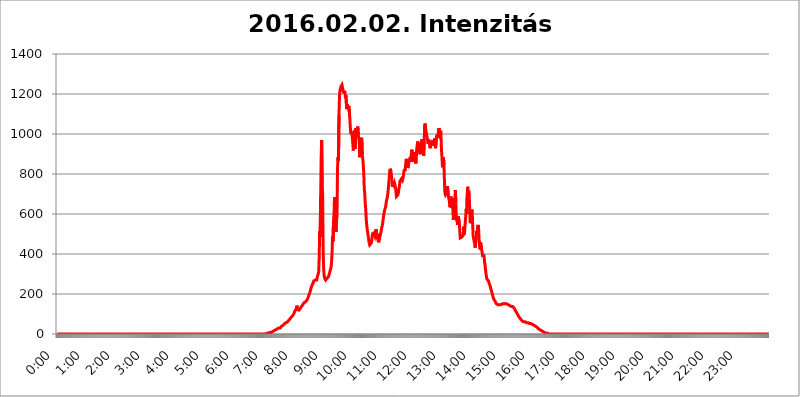
| Category | 2016.02.02. Intenzitás [W/m^2] |
|---|---|
| 0.0 | 0 |
| 0.0006944444444444445 | 0 |
| 0.001388888888888889 | 0 |
| 0.0020833333333333333 | 0 |
| 0.002777777777777778 | 0 |
| 0.003472222222222222 | 0 |
| 0.004166666666666667 | 0 |
| 0.004861111111111111 | 0 |
| 0.005555555555555556 | 0 |
| 0.0062499999999999995 | 0 |
| 0.006944444444444444 | 0 |
| 0.007638888888888889 | 0 |
| 0.008333333333333333 | 0 |
| 0.009027777777777779 | 0 |
| 0.009722222222222222 | 0 |
| 0.010416666666666666 | 0 |
| 0.011111111111111112 | 0 |
| 0.011805555555555555 | 0 |
| 0.012499999999999999 | 0 |
| 0.013194444444444444 | 0 |
| 0.013888888888888888 | 0 |
| 0.014583333333333332 | 0 |
| 0.015277777777777777 | 0 |
| 0.015972222222222224 | 0 |
| 0.016666666666666666 | 0 |
| 0.017361111111111112 | 0 |
| 0.018055555555555557 | 0 |
| 0.01875 | 0 |
| 0.019444444444444445 | 0 |
| 0.02013888888888889 | 0 |
| 0.020833333333333332 | 0 |
| 0.02152777777777778 | 0 |
| 0.022222222222222223 | 0 |
| 0.02291666666666667 | 0 |
| 0.02361111111111111 | 0 |
| 0.024305555555555556 | 0 |
| 0.024999999999999998 | 0 |
| 0.025694444444444447 | 0 |
| 0.02638888888888889 | 0 |
| 0.027083333333333334 | 0 |
| 0.027777777777777776 | 0 |
| 0.02847222222222222 | 0 |
| 0.029166666666666664 | 0 |
| 0.029861111111111113 | 0 |
| 0.030555555555555555 | 0 |
| 0.03125 | 0 |
| 0.03194444444444445 | 0 |
| 0.03263888888888889 | 0 |
| 0.03333333333333333 | 0 |
| 0.034027777777777775 | 0 |
| 0.034722222222222224 | 0 |
| 0.035416666666666666 | 0 |
| 0.036111111111111115 | 0 |
| 0.03680555555555556 | 0 |
| 0.0375 | 0 |
| 0.03819444444444444 | 0 |
| 0.03888888888888889 | 0 |
| 0.03958333333333333 | 0 |
| 0.04027777777777778 | 0 |
| 0.04097222222222222 | 0 |
| 0.041666666666666664 | 0 |
| 0.042361111111111106 | 0 |
| 0.04305555555555556 | 0 |
| 0.043750000000000004 | 0 |
| 0.044444444444444446 | 0 |
| 0.04513888888888889 | 0 |
| 0.04583333333333334 | 0 |
| 0.04652777777777778 | 0 |
| 0.04722222222222222 | 0 |
| 0.04791666666666666 | 0 |
| 0.04861111111111111 | 0 |
| 0.049305555555555554 | 0 |
| 0.049999999999999996 | 0 |
| 0.05069444444444445 | 0 |
| 0.051388888888888894 | 0 |
| 0.052083333333333336 | 0 |
| 0.05277777777777778 | 0 |
| 0.05347222222222222 | 0 |
| 0.05416666666666667 | 0 |
| 0.05486111111111111 | 0 |
| 0.05555555555555555 | 0 |
| 0.05625 | 0 |
| 0.05694444444444444 | 0 |
| 0.057638888888888885 | 0 |
| 0.05833333333333333 | 0 |
| 0.05902777777777778 | 0 |
| 0.059722222222222225 | 0 |
| 0.06041666666666667 | 0 |
| 0.061111111111111116 | 0 |
| 0.06180555555555556 | 0 |
| 0.0625 | 0 |
| 0.06319444444444444 | 0 |
| 0.06388888888888888 | 0 |
| 0.06458333333333334 | 0 |
| 0.06527777777777778 | 0 |
| 0.06597222222222222 | 0 |
| 0.06666666666666667 | 0 |
| 0.06736111111111111 | 0 |
| 0.06805555555555555 | 0 |
| 0.06874999999999999 | 0 |
| 0.06944444444444443 | 0 |
| 0.07013888888888889 | 0 |
| 0.07083333333333333 | 0 |
| 0.07152777777777779 | 0 |
| 0.07222222222222223 | 0 |
| 0.07291666666666667 | 0 |
| 0.07361111111111111 | 0 |
| 0.07430555555555556 | 0 |
| 0.075 | 0 |
| 0.07569444444444444 | 0 |
| 0.0763888888888889 | 0 |
| 0.07708333333333334 | 0 |
| 0.07777777777777778 | 0 |
| 0.07847222222222222 | 0 |
| 0.07916666666666666 | 0 |
| 0.0798611111111111 | 0 |
| 0.08055555555555556 | 0 |
| 0.08125 | 0 |
| 0.08194444444444444 | 0 |
| 0.08263888888888889 | 0 |
| 0.08333333333333333 | 0 |
| 0.08402777777777777 | 0 |
| 0.08472222222222221 | 0 |
| 0.08541666666666665 | 0 |
| 0.08611111111111112 | 0 |
| 0.08680555555555557 | 0 |
| 0.08750000000000001 | 0 |
| 0.08819444444444445 | 0 |
| 0.08888888888888889 | 0 |
| 0.08958333333333333 | 0 |
| 0.09027777777777778 | 0 |
| 0.09097222222222222 | 0 |
| 0.09166666666666667 | 0 |
| 0.09236111111111112 | 0 |
| 0.09305555555555556 | 0 |
| 0.09375 | 0 |
| 0.09444444444444444 | 0 |
| 0.09513888888888888 | 0 |
| 0.09583333333333333 | 0 |
| 0.09652777777777777 | 0 |
| 0.09722222222222222 | 0 |
| 0.09791666666666667 | 0 |
| 0.09861111111111111 | 0 |
| 0.09930555555555555 | 0 |
| 0.09999999999999999 | 0 |
| 0.10069444444444443 | 0 |
| 0.1013888888888889 | 0 |
| 0.10208333333333335 | 0 |
| 0.10277777777777779 | 0 |
| 0.10347222222222223 | 0 |
| 0.10416666666666667 | 0 |
| 0.10486111111111111 | 0 |
| 0.10555555555555556 | 0 |
| 0.10625 | 0 |
| 0.10694444444444444 | 0 |
| 0.1076388888888889 | 0 |
| 0.10833333333333334 | 0 |
| 0.10902777777777778 | 0 |
| 0.10972222222222222 | 0 |
| 0.1111111111111111 | 0 |
| 0.11180555555555556 | 0 |
| 0.11180555555555556 | 0 |
| 0.1125 | 0 |
| 0.11319444444444444 | 0 |
| 0.11388888888888889 | 0 |
| 0.11458333333333333 | 0 |
| 0.11527777777777777 | 0 |
| 0.11597222222222221 | 0 |
| 0.11666666666666665 | 0 |
| 0.1173611111111111 | 0 |
| 0.11805555555555557 | 0 |
| 0.11944444444444445 | 0 |
| 0.12013888888888889 | 0 |
| 0.12083333333333333 | 0 |
| 0.12152777777777778 | 0 |
| 0.12222222222222223 | 0 |
| 0.12291666666666667 | 0 |
| 0.12291666666666667 | 0 |
| 0.12361111111111112 | 0 |
| 0.12430555555555556 | 0 |
| 0.125 | 0 |
| 0.12569444444444444 | 0 |
| 0.12638888888888888 | 0 |
| 0.12708333333333333 | 0 |
| 0.16875 | 0 |
| 0.12847222222222224 | 0 |
| 0.12916666666666668 | 0 |
| 0.12986111111111112 | 0 |
| 0.13055555555555556 | 0 |
| 0.13125 | 0 |
| 0.13194444444444445 | 0 |
| 0.1326388888888889 | 0 |
| 0.13333333333333333 | 0 |
| 0.13402777777777777 | 0 |
| 0.13402777777777777 | 0 |
| 0.13472222222222222 | 0 |
| 0.13541666666666666 | 0 |
| 0.1361111111111111 | 0 |
| 0.13749999999999998 | 0 |
| 0.13819444444444443 | 0 |
| 0.1388888888888889 | 0 |
| 0.13958333333333334 | 0 |
| 0.14027777777777778 | 0 |
| 0.14097222222222222 | 0 |
| 0.14166666666666666 | 0 |
| 0.1423611111111111 | 0 |
| 0.14305555555555557 | 0 |
| 0.14375000000000002 | 0 |
| 0.14444444444444446 | 0 |
| 0.1451388888888889 | 0 |
| 0.1451388888888889 | 0 |
| 0.14652777777777778 | 0 |
| 0.14722222222222223 | 0 |
| 0.14791666666666667 | 0 |
| 0.1486111111111111 | 0 |
| 0.14930555555555555 | 0 |
| 0.15 | 0 |
| 0.15069444444444444 | 0 |
| 0.15138888888888888 | 0 |
| 0.15208333333333332 | 0 |
| 0.15277777777777776 | 0 |
| 0.15347222222222223 | 0 |
| 0.15416666666666667 | 0 |
| 0.15486111111111112 | 0 |
| 0.15555555555555556 | 0 |
| 0.15625 | 0 |
| 0.15694444444444444 | 0 |
| 0.15763888888888888 | 0 |
| 0.15833333333333333 | 0 |
| 0.15902777777777777 | 0 |
| 0.15972222222222224 | 0 |
| 0.16041666666666668 | 0 |
| 0.16111111111111112 | 0 |
| 0.16180555555555556 | 0 |
| 0.1625 | 0 |
| 0.16319444444444445 | 0 |
| 0.1638888888888889 | 0 |
| 0.16458333333333333 | 0 |
| 0.16527777777777777 | 0 |
| 0.16597222222222222 | 0 |
| 0.16666666666666666 | 0 |
| 0.1673611111111111 | 0 |
| 0.16805555555555554 | 0 |
| 0.16874999999999998 | 0 |
| 0.16944444444444443 | 0 |
| 0.17013888888888887 | 0 |
| 0.1708333333333333 | 0 |
| 0.17152777777777775 | 0 |
| 0.17222222222222225 | 0 |
| 0.1729166666666667 | 0 |
| 0.17361111111111113 | 0 |
| 0.17430555555555557 | 0 |
| 0.17500000000000002 | 0 |
| 0.17569444444444446 | 0 |
| 0.1763888888888889 | 0 |
| 0.17708333333333334 | 0 |
| 0.17777777777777778 | 0 |
| 0.17847222222222223 | 0 |
| 0.17916666666666667 | 0 |
| 0.1798611111111111 | 0 |
| 0.18055555555555555 | 0 |
| 0.18125 | 0 |
| 0.18194444444444444 | 0 |
| 0.1826388888888889 | 0 |
| 0.18333333333333335 | 0 |
| 0.1840277777777778 | 0 |
| 0.18472222222222223 | 0 |
| 0.18541666666666667 | 0 |
| 0.18611111111111112 | 0 |
| 0.18680555555555556 | 0 |
| 0.1875 | 0 |
| 0.18819444444444444 | 0 |
| 0.18888888888888888 | 0 |
| 0.18958333333333333 | 0 |
| 0.19027777777777777 | 0 |
| 0.1909722222222222 | 0 |
| 0.19166666666666665 | 0 |
| 0.19236111111111112 | 0 |
| 0.19305555555555554 | 0 |
| 0.19375 | 0 |
| 0.19444444444444445 | 0 |
| 0.1951388888888889 | 0 |
| 0.19583333333333333 | 0 |
| 0.19652777777777777 | 0 |
| 0.19722222222222222 | 0 |
| 0.19791666666666666 | 0 |
| 0.1986111111111111 | 0 |
| 0.19930555555555554 | 0 |
| 0.19999999999999998 | 0 |
| 0.20069444444444443 | 0 |
| 0.20138888888888887 | 0 |
| 0.2020833333333333 | 0 |
| 0.2027777777777778 | 0 |
| 0.2034722222222222 | 0 |
| 0.2041666666666667 | 0 |
| 0.20486111111111113 | 0 |
| 0.20555555555555557 | 0 |
| 0.20625000000000002 | 0 |
| 0.20694444444444446 | 0 |
| 0.2076388888888889 | 0 |
| 0.20833333333333334 | 0 |
| 0.20902777777777778 | 0 |
| 0.20972222222222223 | 0 |
| 0.21041666666666667 | 0 |
| 0.2111111111111111 | 0 |
| 0.21180555555555555 | 0 |
| 0.2125 | 0 |
| 0.21319444444444444 | 0 |
| 0.2138888888888889 | 0 |
| 0.21458333333333335 | 0 |
| 0.2152777777777778 | 0 |
| 0.21597222222222223 | 0 |
| 0.21666666666666667 | 0 |
| 0.21736111111111112 | 0 |
| 0.21805555555555556 | 0 |
| 0.21875 | 0 |
| 0.21944444444444444 | 0 |
| 0.22013888888888888 | 0 |
| 0.22083333333333333 | 0 |
| 0.22152777777777777 | 0 |
| 0.2222222222222222 | 0 |
| 0.22291666666666665 | 0 |
| 0.2236111111111111 | 0 |
| 0.22430555555555556 | 0 |
| 0.225 | 0 |
| 0.22569444444444445 | 0 |
| 0.2263888888888889 | 0 |
| 0.22708333333333333 | 0 |
| 0.22777777777777777 | 0 |
| 0.22847222222222222 | 0 |
| 0.22916666666666666 | 0 |
| 0.2298611111111111 | 0 |
| 0.23055555555555554 | 0 |
| 0.23124999999999998 | 0 |
| 0.23194444444444443 | 0 |
| 0.23263888888888887 | 0 |
| 0.2333333333333333 | 0 |
| 0.2340277777777778 | 0 |
| 0.2347222222222222 | 0 |
| 0.2354166666666667 | 0 |
| 0.23611111111111113 | 0 |
| 0.23680555555555557 | 0 |
| 0.23750000000000002 | 0 |
| 0.23819444444444446 | 0 |
| 0.2388888888888889 | 0 |
| 0.23958333333333334 | 0 |
| 0.24027777777777778 | 0 |
| 0.24097222222222223 | 0 |
| 0.24166666666666667 | 0 |
| 0.2423611111111111 | 0 |
| 0.24305555555555555 | 0 |
| 0.24375 | 0 |
| 0.24444444444444446 | 0 |
| 0.24513888888888888 | 0 |
| 0.24583333333333335 | 0 |
| 0.2465277777777778 | 0 |
| 0.24722222222222223 | 0 |
| 0.24791666666666667 | 0 |
| 0.24861111111111112 | 0 |
| 0.24930555555555556 | 0 |
| 0.25 | 0 |
| 0.25069444444444444 | 0 |
| 0.2513888888888889 | 0 |
| 0.2520833333333333 | 0 |
| 0.25277777777777777 | 0 |
| 0.2534722222222222 | 0 |
| 0.25416666666666665 | 0 |
| 0.2548611111111111 | 0 |
| 0.2555555555555556 | 0 |
| 0.25625000000000003 | 0 |
| 0.2569444444444445 | 0 |
| 0.2576388888888889 | 0 |
| 0.25833333333333336 | 0 |
| 0.2590277777777778 | 0 |
| 0.25972222222222224 | 0 |
| 0.2604166666666667 | 0 |
| 0.2611111111111111 | 0 |
| 0.26180555555555557 | 0 |
| 0.2625 | 0 |
| 0.26319444444444445 | 0 |
| 0.2638888888888889 | 0 |
| 0.26458333333333334 | 0 |
| 0.2652777777777778 | 0 |
| 0.2659722222222222 | 0 |
| 0.26666666666666666 | 0 |
| 0.2673611111111111 | 0 |
| 0.26805555555555555 | 0 |
| 0.26875 | 0 |
| 0.26944444444444443 | 0 |
| 0.2701388888888889 | 0 |
| 0.2708333333333333 | 0 |
| 0.27152777777777776 | 0 |
| 0.2722222222222222 | 0 |
| 0.27291666666666664 | 0 |
| 0.2736111111111111 | 0 |
| 0.2743055555555555 | 0 |
| 0.27499999999999997 | 0 |
| 0.27569444444444446 | 0 |
| 0.27638888888888885 | 0 |
| 0.27708333333333335 | 0 |
| 0.2777777777777778 | 0 |
| 0.27847222222222223 | 0 |
| 0.2791666666666667 | 0 |
| 0.2798611111111111 | 0 |
| 0.28055555555555556 | 0 |
| 0.28125 | 0 |
| 0.28194444444444444 | 0 |
| 0.2826388888888889 | 0 |
| 0.2833333333333333 | 0 |
| 0.28402777777777777 | 0 |
| 0.2847222222222222 | 0 |
| 0.28541666666666665 | 0 |
| 0.28611111111111115 | 0 |
| 0.28680555555555554 | 0 |
| 0.28750000000000003 | 0 |
| 0.2881944444444445 | 0 |
| 0.2888888888888889 | 0 |
| 0.28958333333333336 | 0 |
| 0.2902777777777778 | 0 |
| 0.29097222222222224 | 0 |
| 0.2916666666666667 | 0 |
| 0.2923611111111111 | 0 |
| 0.29305555555555557 | 3.525 |
| 0.29375 | 3.525 |
| 0.29444444444444445 | 3.525 |
| 0.2951388888888889 | 3.525 |
| 0.29583333333333334 | 3.525 |
| 0.2965277777777778 | 3.525 |
| 0.2972222222222222 | 3.525 |
| 0.29791666666666666 | 7.887 |
| 0.2986111111111111 | 7.887 |
| 0.29930555555555555 | 7.887 |
| 0.3 | 7.887 |
| 0.30069444444444443 | 12.257 |
| 0.3013888888888889 | 12.257 |
| 0.3020833333333333 | 12.257 |
| 0.30277777777777776 | 12.257 |
| 0.3034722222222222 | 12.257 |
| 0.30416666666666664 | 16.636 |
| 0.3048611111111111 | 16.636 |
| 0.3055555555555555 | 16.636 |
| 0.30624999999999997 | 21.024 |
| 0.3069444444444444 | 21.024 |
| 0.3076388888888889 | 21.024 |
| 0.30833333333333335 | 25.419 |
| 0.3090277777777778 | 25.419 |
| 0.30972222222222223 | 25.419 |
| 0.3104166666666667 | 29.823 |
| 0.3111111111111111 | 29.823 |
| 0.31180555555555556 | 29.823 |
| 0.3125 | 29.823 |
| 0.31319444444444444 | 34.234 |
| 0.3138888888888889 | 34.234 |
| 0.3145833333333333 | 38.653 |
| 0.31527777777777777 | 38.653 |
| 0.3159722222222222 | 38.653 |
| 0.31666666666666665 | 43.079 |
| 0.31736111111111115 | 47.511 |
| 0.31805555555555554 | 47.511 |
| 0.31875000000000003 | 51.951 |
| 0.3194444444444445 | 51.951 |
| 0.3201388888888889 | 56.398 |
| 0.32083333333333336 | 56.398 |
| 0.3215277777777778 | 60.85 |
| 0.32222222222222224 | 60.85 |
| 0.3229166666666667 | 60.85 |
| 0.3236111111111111 | 65.31 |
| 0.32430555555555557 | 65.31 |
| 0.325 | 69.775 |
| 0.32569444444444445 | 74.246 |
| 0.3263888888888889 | 74.246 |
| 0.32708333333333334 | 78.722 |
| 0.3277777777777778 | 83.205 |
| 0.3284722222222222 | 83.205 |
| 0.32916666666666666 | 87.692 |
| 0.3298611111111111 | 87.692 |
| 0.33055555555555555 | 92.184 |
| 0.33125 | 96.682 |
| 0.33194444444444443 | 101.184 |
| 0.3326388888888889 | 110.201 |
| 0.3333333333333333 | 114.716 |
| 0.3340277777777778 | 119.235 |
| 0.3347222222222222 | 123.758 |
| 0.3354166666666667 | 128.284 |
| 0.3361111111111111 | 141.884 |
| 0.3368055555555556 | 123.758 |
| 0.33749999999999997 | 119.235 |
| 0.33819444444444446 | 119.235 |
| 0.33888888888888885 | 119.235 |
| 0.33958333333333335 | 123.758 |
| 0.34027777777777773 | 123.758 |
| 0.34097222222222223 | 128.284 |
| 0.3416666666666666 | 132.814 |
| 0.3423611111111111 | 137.347 |
| 0.3430555555555555 | 137.347 |
| 0.34375 | 141.884 |
| 0.3444444444444445 | 146.423 |
| 0.3451388888888889 | 150.964 |
| 0.3458333333333334 | 155.509 |
| 0.34652777777777777 | 155.509 |
| 0.34722222222222227 | 155.509 |
| 0.34791666666666665 | 160.056 |
| 0.34861111111111115 | 160.056 |
| 0.34930555555555554 | 164.605 |
| 0.35000000000000003 | 169.156 |
| 0.3506944444444444 | 173.709 |
| 0.3513888888888889 | 178.264 |
| 0.3520833333333333 | 182.82 |
| 0.3527777777777778 | 191.937 |
| 0.3534722222222222 | 196.497 |
| 0.3541666666666667 | 205.62 |
| 0.3548611111111111 | 214.746 |
| 0.35555555555555557 | 223.873 |
| 0.35625 | 233 |
| 0.35694444444444445 | 237.564 |
| 0.3576388888888889 | 246.689 |
| 0.35833333333333334 | 251.251 |
| 0.3590277777777778 | 255.813 |
| 0.3597222222222222 | 264.932 |
| 0.36041666666666666 | 264.932 |
| 0.3611111111111111 | 260.373 |
| 0.36180555555555555 | 269.49 |
| 0.3625 | 274.047 |
| 0.36319444444444443 | 274.047 |
| 0.3638888888888889 | 269.49 |
| 0.3645833333333333 | 283.156 |
| 0.3652777777777778 | 292.259 |
| 0.3659722222222222 | 296.808 |
| 0.3666666666666667 | 310.44 |
| 0.3673611111111111 | 378.224 |
| 0.3680555555555556 | 515.223 |
| 0.36874999999999997 | 484.735 |
| 0.36944444444444446 | 683.473 |
| 0.37013888888888885 | 879.719 |
| 0.37083333333333335 | 970.034 |
| 0.37152777777777773 | 747.834 |
| 0.37222222222222223 | 699.717 |
| 0.3729166666666666 | 418.492 |
| 0.3736111111111111 | 328.584 |
| 0.3743055555555555 | 292.259 |
| 0.375 | 278.603 |
| 0.3756944444444445 | 274.047 |
| 0.3763888888888889 | 269.49 |
| 0.3770833333333334 | 269.49 |
| 0.37777777777777777 | 274.047 |
| 0.37847222222222227 | 278.603 |
| 0.37916666666666665 | 278.603 |
| 0.37986111111111115 | 283.156 |
| 0.38055555555555554 | 287.709 |
| 0.38125000000000003 | 296.808 |
| 0.3819444444444444 | 305.898 |
| 0.3826388888888889 | 314.98 |
| 0.3833333333333333 | 324.052 |
| 0.3840277777777778 | 333.113 |
| 0.3847222222222222 | 360.221 |
| 0.3854166666666667 | 400.638 |
| 0.3861111111111111 | 489.108 |
| 0.38680555555555557 | 462.786 |
| 0.3875 | 566.793 |
| 0.38819444444444445 | 600.661 |
| 0.3888888888888889 | 683.473 |
| 0.38958333333333334 | 625.784 |
| 0.3902777777777778 | 562.53 |
| 0.3909722222222222 | 510.885 |
| 0.39166666666666666 | 575.299 |
| 0.3923611111111111 | 583.779 |
| 0.39305555555555555 | 822.26 |
| 0.39375 | 883.516 |
| 0.39444444444444443 | 864.493 |
| 0.3951388888888889 | 1093.653 |
| 0.3958333333333333 | 1186.03 |
| 0.3965277777777778 | 1217.812 |
| 0.3972222222222222 | 1225.859 |
| 0.3979166666666667 | 1238.014 |
| 0.3986111111111111 | 1233.951 |
| 0.3993055555555556 | 1246.176 |
| 0.39999999999999997 | 1233.951 |
| 0.40069444444444446 | 1238.014 |
| 0.40138888888888885 | 1209.807 |
| 0.40208333333333335 | 1209.807 |
| 0.40277777777777773 | 1213.804 |
| 0.40347222222222223 | 1209.807 |
| 0.4041666666666666 | 1182.099 |
| 0.4048611111111111 | 1193.918 |
| 0.4055555555555555 | 1150.946 |
| 0.40625 | 1124.056 |
| 0.4069444444444445 | 1147.086 |
| 0.4076388888888889 | 1139.384 |
| 0.4083333333333334 | 1131.708 |
| 0.40902777777777777 | 1139.384 |
| 0.40972222222222227 | 1108.816 |
| 0.41041666666666665 | 1074.789 |
| 0.41111111111111115 | 1029.798 |
| 0.41180555555555554 | 999.916 |
| 0.41250000000000003 | 1007.383 |
| 0.4131944444444444 | 999.916 |
| 0.4138888888888889 | 981.244 |
| 0.4145833333333333 | 951.327 |
| 0.4152777777777778 | 917.534 |
| 0.4159722222222222 | 970.034 |
| 0.4166666666666667 | 1007.383 |
| 0.4173611111111111 | 1018.587 |
| 0.41805555555555557 | 925.06 |
| 0.41875 | 1029.798 |
| 0.41944444444444445 | 1029.798 |
| 0.4201388888888889 | 999.916 |
| 0.42083333333333334 | 1026.06 |
| 0.4215277777777778 | 1037.277 |
| 0.4222222222222222 | 996.182 |
| 0.42291666666666666 | 999.916 |
| 0.4236111111111111 | 962.555 |
| 0.42430555555555555 | 883.516 |
| 0.425 | 932.576 |
| 0.42569444444444443 | 962.555 |
| 0.4263888888888889 | 973.772 |
| 0.4270833333333333 | 981.244 |
| 0.4277777777777778 | 894.885 |
| 0.4284722222222222 | 879.719 |
| 0.4291666666666667 | 849.199 |
| 0.4298611111111111 | 806.757 |
| 0.4305555555555556 | 727.896 |
| 0.43124999999999997 | 703.762 |
| 0.43194444444444446 | 654.791 |
| 0.43263888888888885 | 625.784 |
| 0.43333333333333335 | 575.299 |
| 0.43402777777777773 | 545.416 |
| 0.43472222222222223 | 523.88 |
| 0.4354166666666666 | 506.542 |
| 0.4361111111111111 | 506.542 |
| 0.4368055555555555 | 471.582 |
| 0.4375 | 453.968 |
| 0.4381944444444445 | 445.129 |
| 0.4388888888888889 | 440.702 |
| 0.4395833333333334 | 440.702 |
| 0.44027777777777777 | 453.968 |
| 0.44097222222222227 | 462.786 |
| 0.44166666666666665 | 489.108 |
| 0.44236111111111115 | 502.192 |
| 0.44305555555555554 | 502.192 |
| 0.44375000000000003 | 497.836 |
| 0.4444444444444444 | 506.542 |
| 0.4451388888888889 | 506.542 |
| 0.4458333333333333 | 489.108 |
| 0.4465277777777778 | 497.836 |
| 0.4472222222222222 | 523.88 |
| 0.4479166666666667 | 489.108 |
| 0.4486111111111111 | 502.192 |
| 0.44930555555555557 | 475.972 |
| 0.45 | 471.582 |
| 0.45069444444444445 | 458.38 |
| 0.4513888888888889 | 462.786 |
| 0.45208333333333334 | 480.356 |
| 0.4527777777777778 | 489.108 |
| 0.4534722222222222 | 502.192 |
| 0.45416666666666666 | 510.885 |
| 0.4548611111111111 | 528.2 |
| 0.45555555555555555 | 536.82 |
| 0.45625 | 549.704 |
| 0.45694444444444443 | 571.049 |
| 0.4576388888888889 | 588.009 |
| 0.4583333333333333 | 604.864 |
| 0.4590277777777778 | 617.436 |
| 0.4597222222222222 | 617.436 |
| 0.4604166666666667 | 634.105 |
| 0.4611111111111111 | 650.667 |
| 0.4618055555555556 | 667.123 |
| 0.46249999999999997 | 671.22 |
| 0.46319444444444446 | 687.544 |
| 0.46388888888888885 | 711.832 |
| 0.46458333333333335 | 735.89 |
| 0.46527777777777773 | 767.62 |
| 0.46597222222222223 | 798.974 |
| 0.4666666666666666 | 826.123 |
| 0.4673611111111111 | 826.123 |
| 0.4680555555555555 | 814.519 |
| 0.46875 | 810.641 |
| 0.4694444444444445 | 810.641 |
| 0.4701388888888889 | 735.89 |
| 0.4708333333333334 | 763.674 |
| 0.47152777777777777 | 759.723 |
| 0.47222222222222227 | 747.834 |
| 0.47291666666666665 | 755.766 |
| 0.47361111111111115 | 759.723 |
| 0.47430555555555554 | 735.89 |
| 0.47500000000000003 | 711.832 |
| 0.4756944444444444 | 687.544 |
| 0.4763888888888889 | 683.473 |
| 0.4770833333333333 | 691.608 |
| 0.4777777777777778 | 695.666 |
| 0.4784722222222222 | 707.8 |
| 0.4791666666666667 | 727.896 |
| 0.4798611111111111 | 735.89 |
| 0.48055555555555557 | 763.674 |
| 0.48125 | 759.723 |
| 0.48194444444444445 | 759.723 |
| 0.4826388888888889 | 775.492 |
| 0.48333333333333334 | 771.559 |
| 0.4840277777777778 | 767.62 |
| 0.4847222222222222 | 767.62 |
| 0.48541666666666666 | 787.258 |
| 0.4861111111111111 | 810.641 |
| 0.48680555555555555 | 822.26 |
| 0.4875 | 814.519 |
| 0.48819444444444443 | 829.981 |
| 0.4888888888888889 | 856.855 |
| 0.4895833333333333 | 875.918 |
| 0.4902777777777778 | 849.199 |
| 0.4909722222222222 | 841.526 |
| 0.4916666666666667 | 829.981 |
| 0.4923611111111111 | 837.682 |
| 0.4930555555555556 | 856.855 |
| 0.49374999999999997 | 868.305 |
| 0.49444444444444446 | 864.493 |
| 0.49513888888888885 | 883.516 |
| 0.49583333333333335 | 860.676 |
| 0.49652777777777773 | 856.855 |
| 0.49722222222222223 | 921.298 |
| 0.4979166666666666 | 902.447 |
| 0.4986111111111111 | 868.305 |
| 0.4993055555555555 | 860.676 |
| 0.5 | 894.885 |
| 0.5006944444444444 | 909.996 |
| 0.5013888888888889 | 864.493 |
| 0.5020833333333333 | 898.668 |
| 0.5027777777777778 | 853.029 |
| 0.5034722222222222 | 879.719 |
| 0.5041666666666667 | 925.06 |
| 0.5048611111111111 | 928.819 |
| 0.5055555555555555 | 962.555 |
| 0.50625 | 936.33 |
| 0.5069444444444444 | 955.071 |
| 0.5076388888888889 | 925.06 |
| 0.5083333333333333 | 909.996 |
| 0.5090277777777777 | 898.668 |
| 0.5097222222222222 | 940.082 |
| 0.5104166666666666 | 958.814 |
| 0.5111111111111112 | 951.327 |
| 0.5118055555555555 | 973.772 |
| 0.5125000000000001 | 936.33 |
| 0.5131944444444444 | 936.33 |
| 0.513888888888889 | 891.099 |
| 0.5145833333333333 | 951.327 |
| 0.5152777777777778 | 1041.019 |
| 0.5159722222222222 | 1052.255 |
| 0.5166666666666667 | 1026.06 |
| 0.517361111111111 | 1022.323 |
| 0.5180555555555556 | 996.182 |
| 0.5187499999999999 | 999.916 |
| 0.5194444444444445 | 970.034 |
| 0.5201388888888888 | 951.327 |
| 0.5208333333333334 | 973.772 |
| 0.5215277777777778 | 962.555 |
| 0.5222222222222223 | 947.58 |
| 0.5229166666666667 | 928.819 |
| 0.5236111111111111 | 928.819 |
| 0.5243055555555556 | 962.555 |
| 0.525 | 966.295 |
| 0.5256944444444445 | 947.58 |
| 0.5263888888888889 | 970.034 |
| 0.5270833333333333 | 962.555 |
| 0.5277777777777778 | 962.555 |
| 0.5284722222222222 | 940.082 |
| 0.5291666666666667 | 977.508 |
| 0.5298611111111111 | 970.034 |
| 0.5305555555555556 | 928.819 |
| 0.53125 | 928.819 |
| 0.5319444444444444 | 984.98 |
| 0.5326388888888889 | 996.182 |
| 0.5333333333333333 | 981.244 |
| 0.5340277777777778 | 996.182 |
| 0.5347222222222222 | 1014.852 |
| 0.5354166666666667 | 1029.798 |
| 0.5361111111111111 | 1026.06 |
| 0.5368055555555555 | 992.448 |
| 0.5375 | 992.448 |
| 0.5381944444444444 | 999.916 |
| 0.5388888888888889 | 921.298 |
| 0.5395833333333333 | 883.516 |
| 0.5402777777777777 | 833.834 |
| 0.5409722222222222 | 872.114 |
| 0.5416666666666666 | 883.516 |
| 0.5423611111111112 | 849.199 |
| 0.5430555555555555 | 763.674 |
| 0.5437500000000001 | 703.762 |
| 0.5444444444444444 | 695.666 |
| 0.545138888888889 | 695.666 |
| 0.5458333333333333 | 703.762 |
| 0.5465277777777778 | 727.896 |
| 0.5472222222222222 | 739.877 |
| 0.5479166666666667 | 743.859 |
| 0.548611111111111 | 687.544 |
| 0.5493055555555556 | 675.311 |
| 0.5499999999999999 | 663.019 |
| 0.5506944444444445 | 634.105 |
| 0.5513888888888888 | 642.4 |
| 0.5520833333333334 | 687.544 |
| 0.5527777777777778 | 629.948 |
| 0.5534722222222223 | 650.667 |
| 0.5541666666666667 | 679.395 |
| 0.5548611111111111 | 625.784 |
| 0.5555555555555556 | 571.049 |
| 0.55625 | 596.45 |
| 0.5569444444444445 | 625.784 |
| 0.5576388888888889 | 663.019 |
| 0.5583333333333333 | 719.877 |
| 0.5590277777777778 | 654.791 |
| 0.5597222222222222 | 575.299 |
| 0.5604166666666667 | 579.542 |
| 0.5611111111111111 | 558.261 |
| 0.5618055555555556 | 545.416 |
| 0.5625 | 588.009 |
| 0.5631944444444444 | 592.233 |
| 0.5638888888888889 | 558.261 |
| 0.5645833333333333 | 515.223 |
| 0.5652777777777778 | 480.356 |
| 0.5659722222222222 | 480.356 |
| 0.5666666666666667 | 475.972 |
| 0.5673611111111111 | 484.735 |
| 0.5680555555555555 | 484.735 |
| 0.56875 | 480.356 |
| 0.5694444444444444 | 493.475 |
| 0.5701388888888889 | 536.82 |
| 0.5708333333333333 | 497.836 |
| 0.5715277777777777 | 519.555 |
| 0.5722222222222222 | 558.261 |
| 0.5729166666666666 | 588.009 |
| 0.5736111111111112 | 625.784 |
| 0.5743055555555555 | 600.661 |
| 0.5750000000000001 | 695.666 |
| 0.5756944444444444 | 735.89 |
| 0.576388888888889 | 687.544 |
| 0.5770833333333333 | 683.473 |
| 0.5777777777777778 | 695.666 |
| 0.5784722222222222 | 625.784 |
| 0.5791666666666667 | 553.986 |
| 0.579861111111111 | 549.704 |
| 0.5805555555555556 | 566.793 |
| 0.5812499999999999 | 621.613 |
| 0.5819444444444445 | 613.252 |
| 0.5826388888888888 | 549.704 |
| 0.5833333333333334 | 489.108 |
| 0.5840277777777778 | 489.108 |
| 0.5847222222222223 | 462.786 |
| 0.5854166666666667 | 453.968 |
| 0.5861111111111111 | 431.833 |
| 0.5868055555555556 | 453.968 |
| 0.5875 | 475.972 |
| 0.5881944444444445 | 515.223 |
| 0.5888888888888889 | 506.542 |
| 0.5895833333333333 | 502.192 |
| 0.5902777777777778 | 545.416 |
| 0.5909722222222222 | 523.88 |
| 0.5916666666666667 | 471.582 |
| 0.5923611111111111 | 440.702 |
| 0.5930555555555556 | 422.943 |
| 0.59375 | 458.38 |
| 0.5944444444444444 | 453.968 |
| 0.5951388888888889 | 422.943 |
| 0.5958333333333333 | 409.574 |
| 0.5965277777777778 | 391.685 |
| 0.5972222222222222 | 387.202 |
| 0.5979166666666667 | 387.202 |
| 0.5986111111111111 | 391.685 |
| 0.5993055555555555 | 360.221 |
| 0.6 | 346.682 |
| 0.6006944444444444 | 319.517 |
| 0.6013888888888889 | 301.354 |
| 0.6020833333333333 | 283.156 |
| 0.6027777777777777 | 274.047 |
| 0.6034722222222222 | 278.603 |
| 0.6041666666666666 | 269.49 |
| 0.6048611111111112 | 264.932 |
| 0.6055555555555555 | 255.813 |
| 0.6062500000000001 | 251.251 |
| 0.6069444444444444 | 242.127 |
| 0.607638888888889 | 233 |
| 0.6083333333333333 | 223.873 |
| 0.6090277777777778 | 214.746 |
| 0.6097222222222222 | 205.62 |
| 0.6104166666666667 | 196.497 |
| 0.611111111111111 | 187.378 |
| 0.6118055555555556 | 178.264 |
| 0.6124999999999999 | 173.709 |
| 0.6131944444444445 | 169.156 |
| 0.6138888888888888 | 164.605 |
| 0.6145833333333334 | 160.056 |
| 0.6152777777777778 | 155.509 |
| 0.6159722222222223 | 150.964 |
| 0.6166666666666667 | 150.964 |
| 0.6173611111111111 | 146.423 |
| 0.6180555555555556 | 146.423 |
| 0.61875 | 146.423 |
| 0.6194444444444445 | 146.423 |
| 0.6201388888888889 | 146.423 |
| 0.6208333333333333 | 146.423 |
| 0.6215277777777778 | 146.423 |
| 0.6222222222222222 | 146.423 |
| 0.6229166666666667 | 146.423 |
| 0.6236111111111111 | 146.423 |
| 0.6243055555555556 | 150.964 |
| 0.625 | 150.964 |
| 0.6256944444444444 | 150.964 |
| 0.6263888888888889 | 150.964 |
| 0.6270833333333333 | 150.964 |
| 0.6277777777777778 | 150.964 |
| 0.6284722222222222 | 150.964 |
| 0.6291666666666667 | 150.964 |
| 0.6298611111111111 | 150.964 |
| 0.6305555555555555 | 150.964 |
| 0.63125 | 146.423 |
| 0.6319444444444444 | 146.423 |
| 0.6326388888888889 | 146.423 |
| 0.6333333333333333 | 141.884 |
| 0.6340277777777777 | 141.884 |
| 0.6347222222222222 | 141.884 |
| 0.6354166666666666 | 137.347 |
| 0.6361111111111112 | 137.347 |
| 0.6368055555555555 | 137.347 |
| 0.6375000000000001 | 137.347 |
| 0.6381944444444444 | 137.347 |
| 0.638888888888889 | 137.347 |
| 0.6395833333333333 | 132.814 |
| 0.6402777777777778 | 132.814 |
| 0.6409722222222222 | 128.284 |
| 0.6416666666666667 | 123.758 |
| 0.642361111111111 | 119.235 |
| 0.6430555555555556 | 114.716 |
| 0.6437499999999999 | 110.201 |
| 0.6444444444444445 | 105.69 |
| 0.6451388888888888 | 101.184 |
| 0.6458333333333334 | 96.682 |
| 0.6465277777777778 | 92.184 |
| 0.6472222222222223 | 87.692 |
| 0.6479166666666667 | 83.205 |
| 0.6486111111111111 | 83.205 |
| 0.6493055555555556 | 78.722 |
| 0.65 | 74.246 |
| 0.6506944444444445 | 69.775 |
| 0.6513888888888889 | 69.775 |
| 0.6520833333333333 | 65.31 |
| 0.6527777777777778 | 65.31 |
| 0.6534722222222222 | 65.31 |
| 0.6541666666666667 | 60.85 |
| 0.6548611111111111 | 60.85 |
| 0.6555555555555556 | 60.85 |
| 0.65625 | 60.85 |
| 0.6569444444444444 | 60.85 |
| 0.6576388888888889 | 56.398 |
| 0.6583333333333333 | 56.398 |
| 0.6590277777777778 | 56.398 |
| 0.6597222222222222 | 56.398 |
| 0.6604166666666667 | 56.398 |
| 0.6611111111111111 | 56.398 |
| 0.6618055555555555 | 56.398 |
| 0.6625 | 51.951 |
| 0.6631944444444444 | 51.951 |
| 0.6638888888888889 | 51.951 |
| 0.6645833333333333 | 51.951 |
| 0.6652777777777777 | 47.511 |
| 0.6659722222222222 | 47.511 |
| 0.6666666666666666 | 47.511 |
| 0.6673611111111111 | 47.511 |
| 0.6680555555555556 | 43.079 |
| 0.6687500000000001 | 43.079 |
| 0.6694444444444444 | 43.079 |
| 0.6701388888888888 | 38.653 |
| 0.6708333333333334 | 38.653 |
| 0.6715277777777778 | 38.653 |
| 0.6722222222222222 | 34.234 |
| 0.6729166666666666 | 34.234 |
| 0.6736111111111112 | 29.823 |
| 0.6743055555555556 | 29.823 |
| 0.6749999999999999 | 25.419 |
| 0.6756944444444444 | 25.419 |
| 0.6763888888888889 | 21.024 |
| 0.6770833333333334 | 21.024 |
| 0.6777777777777777 | 21.024 |
| 0.6784722222222223 | 16.636 |
| 0.6791666666666667 | 16.636 |
| 0.6798611111111111 | 12.257 |
| 0.6805555555555555 | 12.257 |
| 0.68125 | 12.257 |
| 0.6819444444444445 | 7.887 |
| 0.6826388888888889 | 7.887 |
| 0.6833333333333332 | 7.887 |
| 0.6840277777777778 | 3.525 |
| 0.6847222222222222 | 3.525 |
| 0.6854166666666667 | 3.525 |
| 0.686111111111111 | 3.525 |
| 0.6868055555555556 | 3.525 |
| 0.6875 | 3.525 |
| 0.6881944444444444 | 0 |
| 0.688888888888889 | 0 |
| 0.6895833333333333 | 0 |
| 0.6902777777777778 | 0 |
| 0.6909722222222222 | 0 |
| 0.6916666666666668 | 0 |
| 0.6923611111111111 | 0 |
| 0.6930555555555555 | 0 |
| 0.69375 | 0 |
| 0.6944444444444445 | 0 |
| 0.6951388888888889 | 0 |
| 0.6958333333333333 | 0 |
| 0.6965277777777777 | 0 |
| 0.6972222222222223 | 0 |
| 0.6979166666666666 | 0 |
| 0.6986111111111111 | 0 |
| 0.6993055555555556 | 0 |
| 0.7000000000000001 | 0 |
| 0.7006944444444444 | 0 |
| 0.7013888888888888 | 0 |
| 0.7020833333333334 | 0 |
| 0.7027777777777778 | 0 |
| 0.7034722222222222 | 0 |
| 0.7041666666666666 | 0 |
| 0.7048611111111112 | 0 |
| 0.7055555555555556 | 0 |
| 0.7062499999999999 | 0 |
| 0.7069444444444444 | 0 |
| 0.7076388888888889 | 0 |
| 0.7083333333333334 | 0 |
| 0.7090277777777777 | 0 |
| 0.7097222222222223 | 0 |
| 0.7104166666666667 | 0 |
| 0.7111111111111111 | 0 |
| 0.7118055555555555 | 0 |
| 0.7125 | 0 |
| 0.7131944444444445 | 0 |
| 0.7138888888888889 | 0 |
| 0.7145833333333332 | 0 |
| 0.7152777777777778 | 0 |
| 0.7159722222222222 | 0 |
| 0.7166666666666667 | 0 |
| 0.717361111111111 | 0 |
| 0.7180555555555556 | 0 |
| 0.71875 | 0 |
| 0.7194444444444444 | 0 |
| 0.720138888888889 | 0 |
| 0.7208333333333333 | 0 |
| 0.7215277777777778 | 0 |
| 0.7222222222222222 | 0 |
| 0.7229166666666668 | 0 |
| 0.7236111111111111 | 0 |
| 0.7243055555555555 | 0 |
| 0.725 | 0 |
| 0.7256944444444445 | 0 |
| 0.7263888888888889 | 0 |
| 0.7270833333333333 | 0 |
| 0.7277777777777777 | 0 |
| 0.7284722222222223 | 0 |
| 0.7291666666666666 | 0 |
| 0.7298611111111111 | 0 |
| 0.7305555555555556 | 0 |
| 0.7312500000000001 | 0 |
| 0.7319444444444444 | 0 |
| 0.7326388888888888 | 0 |
| 0.7333333333333334 | 0 |
| 0.7340277777777778 | 0 |
| 0.7347222222222222 | 0 |
| 0.7354166666666666 | 0 |
| 0.7361111111111112 | 0 |
| 0.7368055555555556 | 0 |
| 0.7374999999999999 | 0 |
| 0.7381944444444444 | 0 |
| 0.7388888888888889 | 0 |
| 0.7395833333333334 | 0 |
| 0.7402777777777777 | 0 |
| 0.7409722222222223 | 0 |
| 0.7416666666666667 | 0 |
| 0.7423611111111111 | 0 |
| 0.7430555555555555 | 0 |
| 0.74375 | 0 |
| 0.7444444444444445 | 0 |
| 0.7451388888888889 | 0 |
| 0.7458333333333332 | 0 |
| 0.7465277777777778 | 0 |
| 0.7472222222222222 | 0 |
| 0.7479166666666667 | 0 |
| 0.748611111111111 | 0 |
| 0.7493055555555556 | 0 |
| 0.75 | 0 |
| 0.7506944444444444 | 0 |
| 0.751388888888889 | 0 |
| 0.7520833333333333 | 0 |
| 0.7527777777777778 | 0 |
| 0.7534722222222222 | 0 |
| 0.7541666666666668 | 0 |
| 0.7548611111111111 | 0 |
| 0.7555555555555555 | 0 |
| 0.75625 | 0 |
| 0.7569444444444445 | 0 |
| 0.7576388888888889 | 0 |
| 0.7583333333333333 | 0 |
| 0.7590277777777777 | 0 |
| 0.7597222222222223 | 0 |
| 0.7604166666666666 | 0 |
| 0.7611111111111111 | 0 |
| 0.7618055555555556 | 0 |
| 0.7625000000000001 | 0 |
| 0.7631944444444444 | 0 |
| 0.7638888888888888 | 0 |
| 0.7645833333333334 | 0 |
| 0.7652777777777778 | 0 |
| 0.7659722222222222 | 0 |
| 0.7666666666666666 | 0 |
| 0.7673611111111112 | 0 |
| 0.7680555555555556 | 0 |
| 0.7687499999999999 | 0 |
| 0.7694444444444444 | 0 |
| 0.7701388888888889 | 0 |
| 0.7708333333333334 | 0 |
| 0.7715277777777777 | 0 |
| 0.7722222222222223 | 0 |
| 0.7729166666666667 | 0 |
| 0.7736111111111111 | 0 |
| 0.7743055555555555 | 0 |
| 0.775 | 0 |
| 0.7756944444444445 | 0 |
| 0.7763888888888889 | 0 |
| 0.7770833333333332 | 0 |
| 0.7777777777777778 | 0 |
| 0.7784722222222222 | 0 |
| 0.7791666666666667 | 0 |
| 0.779861111111111 | 0 |
| 0.7805555555555556 | 0 |
| 0.78125 | 0 |
| 0.7819444444444444 | 0 |
| 0.782638888888889 | 0 |
| 0.7833333333333333 | 0 |
| 0.7840277777777778 | 0 |
| 0.7847222222222222 | 0 |
| 0.7854166666666668 | 0 |
| 0.7861111111111111 | 0 |
| 0.7868055555555555 | 0 |
| 0.7875 | 0 |
| 0.7881944444444445 | 0 |
| 0.7888888888888889 | 0 |
| 0.7895833333333333 | 0 |
| 0.7902777777777777 | 0 |
| 0.7909722222222223 | 0 |
| 0.7916666666666666 | 0 |
| 0.7923611111111111 | 0 |
| 0.7930555555555556 | 0 |
| 0.7937500000000001 | 0 |
| 0.7944444444444444 | 0 |
| 0.7951388888888888 | 0 |
| 0.7958333333333334 | 0 |
| 0.7965277777777778 | 0 |
| 0.7972222222222222 | 0 |
| 0.7979166666666666 | 0 |
| 0.7986111111111112 | 0 |
| 0.7993055555555556 | 0 |
| 0.7999999999999999 | 0 |
| 0.8006944444444444 | 0 |
| 0.8013888888888889 | 0 |
| 0.8020833333333334 | 0 |
| 0.8027777777777777 | 0 |
| 0.8034722222222223 | 0 |
| 0.8041666666666667 | 0 |
| 0.8048611111111111 | 0 |
| 0.8055555555555555 | 0 |
| 0.80625 | 0 |
| 0.8069444444444445 | 0 |
| 0.8076388888888889 | 0 |
| 0.8083333333333332 | 0 |
| 0.8090277777777778 | 0 |
| 0.8097222222222222 | 0 |
| 0.8104166666666667 | 0 |
| 0.811111111111111 | 0 |
| 0.8118055555555556 | 0 |
| 0.8125 | 0 |
| 0.8131944444444444 | 0 |
| 0.813888888888889 | 0 |
| 0.8145833333333333 | 0 |
| 0.8152777777777778 | 0 |
| 0.8159722222222222 | 0 |
| 0.8166666666666668 | 0 |
| 0.8173611111111111 | 0 |
| 0.8180555555555555 | 0 |
| 0.81875 | 0 |
| 0.8194444444444445 | 0 |
| 0.8201388888888889 | 0 |
| 0.8208333333333333 | 0 |
| 0.8215277777777777 | 0 |
| 0.8222222222222223 | 0 |
| 0.8229166666666666 | 0 |
| 0.8236111111111111 | 0 |
| 0.8243055555555556 | 0 |
| 0.8250000000000001 | 0 |
| 0.8256944444444444 | 0 |
| 0.8263888888888888 | 0 |
| 0.8270833333333334 | 0 |
| 0.8277777777777778 | 0 |
| 0.8284722222222222 | 0 |
| 0.8291666666666666 | 0 |
| 0.8298611111111112 | 0 |
| 0.8305555555555556 | 0 |
| 0.8312499999999999 | 0 |
| 0.8319444444444444 | 0 |
| 0.8326388888888889 | 0 |
| 0.8333333333333334 | 0 |
| 0.8340277777777777 | 0 |
| 0.8347222222222223 | 0 |
| 0.8354166666666667 | 0 |
| 0.8361111111111111 | 0 |
| 0.8368055555555555 | 0 |
| 0.8375 | 0 |
| 0.8381944444444445 | 0 |
| 0.8388888888888889 | 0 |
| 0.8395833333333332 | 0 |
| 0.8402777777777778 | 0 |
| 0.8409722222222222 | 0 |
| 0.8416666666666667 | 0 |
| 0.842361111111111 | 0 |
| 0.8430555555555556 | 0 |
| 0.84375 | 0 |
| 0.8444444444444444 | 0 |
| 0.845138888888889 | 0 |
| 0.8458333333333333 | 0 |
| 0.8465277777777778 | 0 |
| 0.8472222222222222 | 0 |
| 0.8479166666666668 | 0 |
| 0.8486111111111111 | 0 |
| 0.8493055555555555 | 0 |
| 0.85 | 0 |
| 0.8506944444444445 | 0 |
| 0.8513888888888889 | 0 |
| 0.8520833333333333 | 0 |
| 0.8527777777777777 | 0 |
| 0.8534722222222223 | 0 |
| 0.8541666666666666 | 0 |
| 0.8548611111111111 | 0 |
| 0.8555555555555556 | 0 |
| 0.8562500000000001 | 0 |
| 0.8569444444444444 | 0 |
| 0.8576388888888888 | 0 |
| 0.8583333333333334 | 0 |
| 0.8590277777777778 | 0 |
| 0.8597222222222222 | 0 |
| 0.8604166666666666 | 0 |
| 0.8611111111111112 | 0 |
| 0.8618055555555556 | 0 |
| 0.8624999999999999 | 0 |
| 0.8631944444444444 | 0 |
| 0.8638888888888889 | 0 |
| 0.8645833333333334 | 0 |
| 0.8652777777777777 | 0 |
| 0.8659722222222223 | 0 |
| 0.8666666666666667 | 0 |
| 0.8673611111111111 | 0 |
| 0.8680555555555555 | 0 |
| 0.86875 | 0 |
| 0.8694444444444445 | 0 |
| 0.8701388888888889 | 0 |
| 0.8708333333333332 | 0 |
| 0.8715277777777778 | 0 |
| 0.8722222222222222 | 0 |
| 0.8729166666666667 | 0 |
| 0.873611111111111 | 0 |
| 0.8743055555555556 | 0 |
| 0.875 | 0 |
| 0.8756944444444444 | 0 |
| 0.876388888888889 | 0 |
| 0.8770833333333333 | 0 |
| 0.8777777777777778 | 0 |
| 0.8784722222222222 | 0 |
| 0.8791666666666668 | 0 |
| 0.8798611111111111 | 0 |
| 0.8805555555555555 | 0 |
| 0.88125 | 0 |
| 0.8819444444444445 | 0 |
| 0.8826388888888889 | 0 |
| 0.8833333333333333 | 0 |
| 0.8840277777777777 | 0 |
| 0.8847222222222223 | 0 |
| 0.8854166666666666 | 0 |
| 0.8861111111111111 | 0 |
| 0.8868055555555556 | 0 |
| 0.8875000000000001 | 0 |
| 0.8881944444444444 | 0 |
| 0.8888888888888888 | 0 |
| 0.8895833333333334 | 0 |
| 0.8902777777777778 | 0 |
| 0.8909722222222222 | 0 |
| 0.8916666666666666 | 0 |
| 0.8923611111111112 | 0 |
| 0.8930555555555556 | 0 |
| 0.8937499999999999 | 0 |
| 0.8944444444444444 | 0 |
| 0.8951388888888889 | 0 |
| 0.8958333333333334 | 0 |
| 0.8965277777777777 | 0 |
| 0.8972222222222223 | 0 |
| 0.8979166666666667 | 0 |
| 0.8986111111111111 | 0 |
| 0.8993055555555555 | 0 |
| 0.9 | 0 |
| 0.9006944444444445 | 0 |
| 0.9013888888888889 | 0 |
| 0.9020833333333332 | 0 |
| 0.9027777777777778 | 0 |
| 0.9034722222222222 | 0 |
| 0.9041666666666667 | 0 |
| 0.904861111111111 | 0 |
| 0.9055555555555556 | 0 |
| 0.90625 | 0 |
| 0.9069444444444444 | 0 |
| 0.907638888888889 | 0 |
| 0.9083333333333333 | 0 |
| 0.9090277777777778 | 0 |
| 0.9097222222222222 | 0 |
| 0.9104166666666668 | 0 |
| 0.9111111111111111 | 0 |
| 0.9118055555555555 | 0 |
| 0.9125 | 0 |
| 0.9131944444444445 | 0 |
| 0.9138888888888889 | 0 |
| 0.9145833333333333 | 0 |
| 0.9152777777777777 | 0 |
| 0.9159722222222223 | 0 |
| 0.9166666666666666 | 0 |
| 0.9173611111111111 | 0 |
| 0.9180555555555556 | 0 |
| 0.9187500000000001 | 0 |
| 0.9194444444444444 | 0 |
| 0.9201388888888888 | 0 |
| 0.9208333333333334 | 0 |
| 0.9215277777777778 | 0 |
| 0.9222222222222222 | 0 |
| 0.9229166666666666 | 0 |
| 0.9236111111111112 | 0 |
| 0.9243055555555556 | 0 |
| 0.9249999999999999 | 0 |
| 0.9256944444444444 | 0 |
| 0.9263888888888889 | 0 |
| 0.9270833333333334 | 0 |
| 0.9277777777777777 | 0 |
| 0.9284722222222223 | 0 |
| 0.9291666666666667 | 0 |
| 0.9298611111111111 | 0 |
| 0.9305555555555555 | 0 |
| 0.93125 | 0 |
| 0.9319444444444445 | 0 |
| 0.9326388888888889 | 0 |
| 0.9333333333333332 | 0 |
| 0.9340277777777778 | 0 |
| 0.9347222222222222 | 0 |
| 0.9354166666666667 | 0 |
| 0.936111111111111 | 0 |
| 0.9368055555555556 | 0 |
| 0.9375 | 0 |
| 0.9381944444444444 | 0 |
| 0.938888888888889 | 0 |
| 0.9395833333333333 | 0 |
| 0.9402777777777778 | 0 |
| 0.9409722222222222 | 0 |
| 0.9416666666666668 | 0 |
| 0.9423611111111111 | 0 |
| 0.9430555555555555 | 0 |
| 0.94375 | 0 |
| 0.9444444444444445 | 0 |
| 0.9451388888888889 | 0 |
| 0.9458333333333333 | 0 |
| 0.9465277777777777 | 0 |
| 0.9472222222222223 | 0 |
| 0.9479166666666666 | 0 |
| 0.9486111111111111 | 0 |
| 0.9493055555555556 | 0 |
| 0.9500000000000001 | 0 |
| 0.9506944444444444 | 0 |
| 0.9513888888888888 | 0 |
| 0.9520833333333334 | 0 |
| 0.9527777777777778 | 0 |
| 0.9534722222222222 | 0 |
| 0.9541666666666666 | 0 |
| 0.9548611111111112 | 0 |
| 0.9555555555555556 | 0 |
| 0.9562499999999999 | 0 |
| 0.9569444444444444 | 0 |
| 0.9576388888888889 | 0 |
| 0.9583333333333334 | 0 |
| 0.9590277777777777 | 0 |
| 0.9597222222222223 | 0 |
| 0.9604166666666667 | 0 |
| 0.9611111111111111 | 0 |
| 0.9618055555555555 | 0 |
| 0.9625 | 0 |
| 0.9631944444444445 | 0 |
| 0.9638888888888889 | 0 |
| 0.9645833333333332 | 0 |
| 0.9652777777777778 | 0 |
| 0.9659722222222222 | 0 |
| 0.9666666666666667 | 0 |
| 0.967361111111111 | 0 |
| 0.9680555555555556 | 0 |
| 0.96875 | 0 |
| 0.9694444444444444 | 0 |
| 0.970138888888889 | 0 |
| 0.9708333333333333 | 0 |
| 0.9715277777777778 | 0 |
| 0.9722222222222222 | 0 |
| 0.9729166666666668 | 0 |
| 0.9736111111111111 | 0 |
| 0.9743055555555555 | 0 |
| 0.975 | 0 |
| 0.9756944444444445 | 0 |
| 0.9763888888888889 | 0 |
| 0.9770833333333333 | 0 |
| 0.9777777777777777 | 0 |
| 0.9784722222222223 | 0 |
| 0.9791666666666666 | 0 |
| 0.9798611111111111 | 0 |
| 0.9805555555555556 | 0 |
| 0.9812500000000001 | 0 |
| 0.9819444444444444 | 0 |
| 0.9826388888888888 | 0 |
| 0.9833333333333334 | 0 |
| 0.9840277777777778 | 0 |
| 0.9847222222222222 | 0 |
| 0.9854166666666666 | 0 |
| 0.9861111111111112 | 0 |
| 0.9868055555555556 | 0 |
| 0.9874999999999999 | 0 |
| 0.9881944444444444 | 0 |
| 0.9888888888888889 | 0 |
| 0.9895833333333334 | 0 |
| 0.9902777777777777 | 0 |
| 0.9909722222222223 | 0 |
| 0.9916666666666667 | 0 |
| 0.9923611111111111 | 0 |
| 0.9930555555555555 | 0 |
| 0.99375 | 0 |
| 0.9944444444444445 | 0 |
| 0.9951388888888889 | 0 |
| 0.9958333333333332 | 0 |
| 0.9965277777777778 | 0 |
| 0.9972222222222222 | 0 |
| 0.9979166666666667 | 0 |
| 0.998611111111111 | 0 |
| 0.9993055555555556 | 0 |